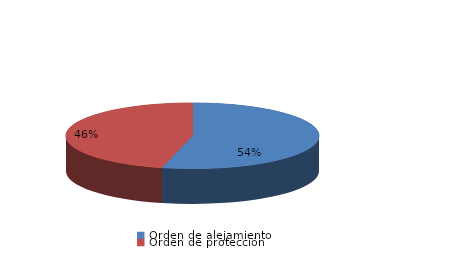
| Category | Series 0 |
|---|---|
| Orden de alejamiento | 7 |
| Orden de protección | 6 |